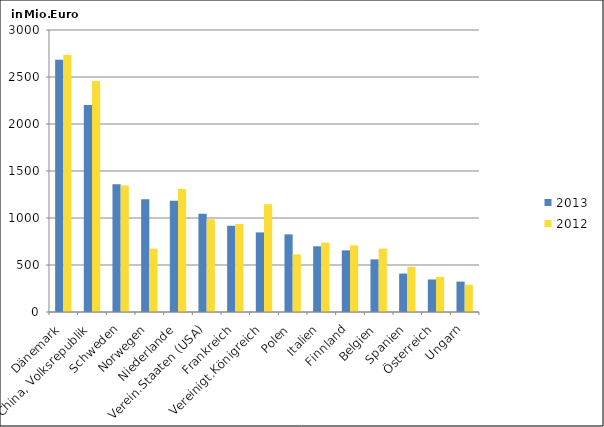
| Category | 2013 | 2012 |
|---|---|---|
| Dänemark | 2683.755 | 2734.88 |
| China, Volksrepublik | 2203.286 | 2457.968 |
| Schweden | 1358.22 | 1344.595 |
| Norwegen | 1200.149 | 674.387 |
| Niederlande | 1183.835 | 1307.702 |
| Verein.Staaten (USA) | 1045.517 | 985.825 |
| Frankreich | 917.425 | 937.433 |
| Vereinigt.Königreich | 846.837 | 1147.098 |
| Polen | 825.571 | 613.538 |
| Italien | 699.007 | 737.777 |
| Finnland | 655.728 | 709.361 |
| Belgien | 560.06 | 674.474 |
| Spanien | 409.025 | 480.304 |
| Österreich | 346.237 | 373.438 |
| Ungarn | 323.388 | 291.118 |